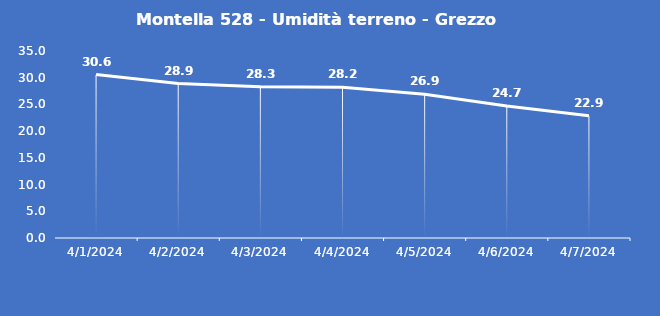
| Category | Montella 528 - Umidità terreno - Grezzo (%VWC) |
|---|---|
| 4/1/24 | 30.6 |
| 4/2/24 | 28.9 |
| 4/3/24 | 28.3 |
| 4/4/24 | 28.2 |
| 4/5/24 | 26.9 |
| 4/6/24 | 24.7 |
| 4/7/24 | 22.9 |